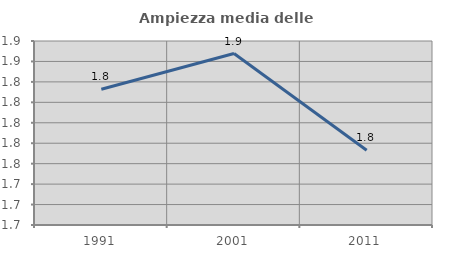
| Category | Ampiezza media delle famiglie |
|---|---|
| 1991.0 | 1.833 |
| 2001.0 | 1.868 |
| 2011.0 | 1.773 |